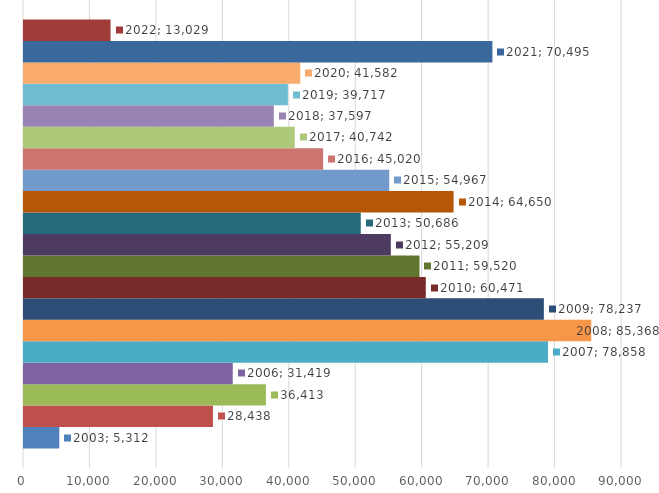
| Category | 2003 | 2004 | 2005 | 2006 | 2007 | 2008 | 2009 | 2010 | 2011 | 2012 | 2013 | 2014 | 2015 | 2016 | 2017 | 2018 | 2019 | 2020 | 2021 | 2022 |
|---|---|---|---|---|---|---|---|---|---|---|---|---|---|---|---|---|---|---|---|---|
| 0 | 5312 | 28438 | 36413 | 31419 | 78858 | 85368 | 78237 | 60471 | 59520 | 55209 | 50686 | 64650 | 54967 | 45020 | 40742 | 37597 | 39717 | 41582 | 70495 | 13029 |